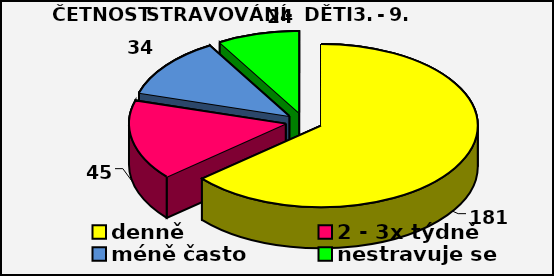
| Category | Series 0 |
|---|---|
| denně | 181 |
| 2 - 3x týdně | 45 |
| méně často | 34 |
| nestravuje se  | 24 |